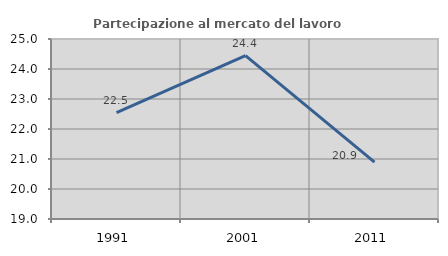
| Category | Partecipazione al mercato del lavoro  femminile |
|---|---|
| 1991.0 | 22.549 |
| 2001.0 | 24.444 |
| 2011.0 | 20.896 |